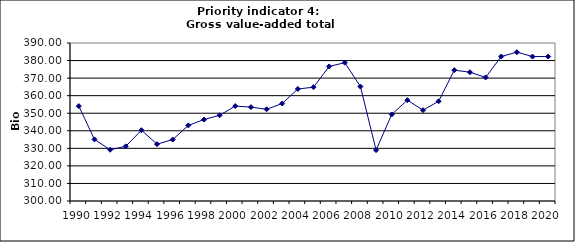
| Category | Gross value-added total industry, Bio Euro (EC95) |
|---|---|
| 1990 | 354.058 |
| 1991 | 335.084 |
| 1992 | 329.188 |
| 1993 | 331.128 |
| 1994 | 340.331 |
| 1995 | 332.371 |
| 1996 | 334.98 |
| 1997 | 343.075 |
| 1998 | 346.384 |
| 1999 | 348.83 |
| 2000 | 354.087 |
| 2001 | 353.489 |
| 2002 | 352.245 |
| 2003 | 355.536 |
| 2004 | 363.797 |
| 2005 | 364.819 |
| 2006 | 376.646 |
| 2007 | 378.797 |
| 2008 | 365.194 |
| 2009 | 328.99 |
| 2010 | 349.298 |
| 2011 | 357.453 |
| 2012 | 351.731 |
| 2013 | 356.811 |
| 2014 | 374.525 |
| 2015 | 373.364 |
| 2016 | 370.396 |
| 2017 | 382.309 |
| 2018 | 384.786 |
| 2019 | 382.281 |
| 2020 | 382.281 |